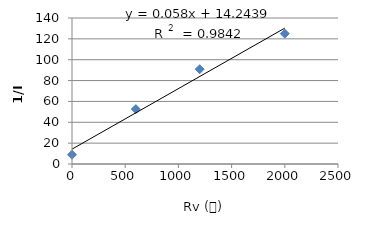
| Category | Series 0 |
|---|---|
| 0.0 | 8.929 |
| 600.0 | 52.632 |
| 1200.0 | 90.909 |
| 2000.0 | 125 |